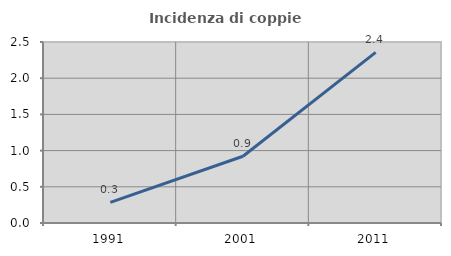
| Category | Incidenza di coppie miste |
|---|---|
| 1991.0 | 0.285 |
| 2001.0 | 0.923 |
| 2011.0 | 2.356 |